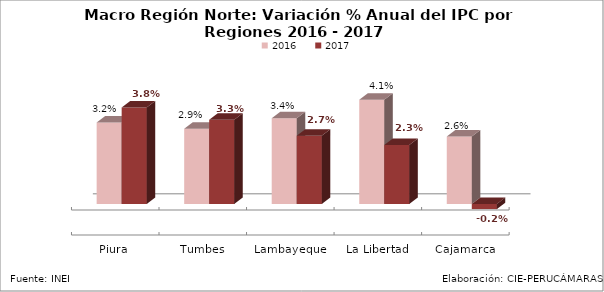
| Category | 2016 | 2017 |
|---|---|---|
| Piura | 0.032 | 0.038 |
| Tumbes | 0.029 | 0.033 |
| Lambayeque | 0.034 | 0.027 |
| La Libertad | 0.041 | 0.023 |
| Cajamarca | 0.026 | -0.002 |